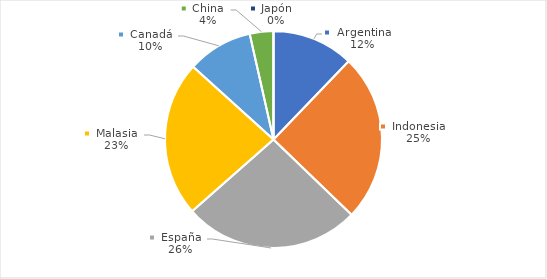
| Category | Series 0 |
|---|---|
| Argentina | 169.125 |
| Indonesia | 347.69 |
| España | 365.256 |
| Malasia | 322.21 |
| Canadá | 135.643 |
| China | 48.966 |
| Japón | 0.05 |